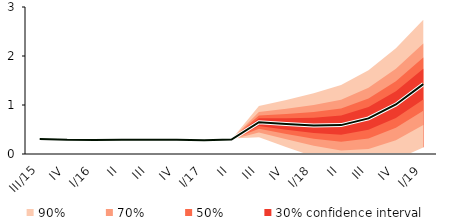
| Category | linka | Centerline |
|---|---|---|
| III/15 | 0.306 | 0.306 |
| IV | 0.29 | 0.29 |
| I/16 | 0.286 | 0.286 |
| II | 0.29 | 0.29 |
| III | 0.29 | 0.29 |
| IV | 0.289 | 0.289 |
| I/17 | 0.28 | 0.28 |
| II | 0.294 | 0.294 |
| III | 0.649 | 0.649 |
| IV | 0.612 | 0.612 |
| I/18 | 0.583 | 0.583 |
| II | 0.589 | 0.589 |
| III | 0.727 | 0.727 |
| IV | 1.01 | 1.01 |
| I/19 | 1.426 | 1.426 |